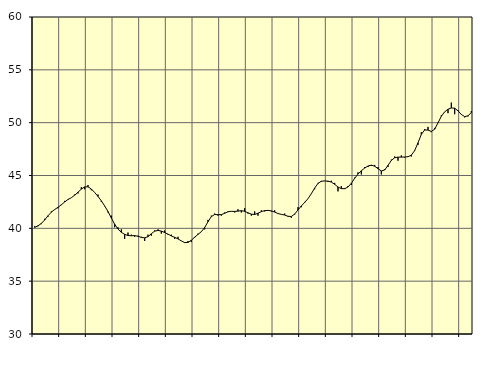
| Category | Piggar | Samtliga fast anställda (inkl. fast anställda utomlands) |
|---|---|---|
| nan | 40.2 | 40.09 |
| 87.0 | 40.2 | 40.24 |
| 87.0 | 40.4 | 40.46 |
| 87.0 | 40.9 | 40.79 |
| nan | 41.1 | 41.19 |
| 88.0 | 41.6 | 41.53 |
| 88.0 | 41.8 | 41.78 |
| 88.0 | 41.9 | 41.99 |
| nan | 42.2 | 42.23 |
| 89.0 | 42.6 | 42.49 |
| 89.0 | 42.7 | 42.73 |
| 89.0 | 42.9 | 42.9 |
| nan | 43.2 | 43.13 |
| 90.0 | 43.3 | 43.42 |
| 90.0 | 43.9 | 43.71 |
| 90.0 | 43.7 | 43.92 |
| nan | 44.1 | 43.93 |
| 91.0 | 43.6 | 43.72 |
| 91.0 | 43.4 | 43.39 |
| 91.0 | 43.2 | 43.02 |
| nan | 42.5 | 42.6 |
| 92.0 | 42.1 | 42.12 |
| 92.0 | 41.5 | 41.59 |
| 92.0 | 41.2 | 40.98 |
| nan | 40.1 | 40.39 |
| 93.0 | 40.1 | 39.93 |
| 93.0 | 39.9 | 39.62 |
| 93.0 | 39 | 39.43 |
| nan | 39.6 | 39.32 |
| 94.0 | 39.4 | 39.3 |
| 94.0 | 39.2 | 39.31 |
| 94.0 | 39.3 | 39.25 |
| nan | 39.2 | 39.14 |
| 95.0 | 38.8 | 39.1 |
| 95.0 | 39.4 | 39.21 |
| 95.0 | 39.3 | 39.49 |
| nan | 39.8 | 39.73 |
| 96.0 | 39.9 | 39.8 |
| 96.0 | 39.5 | 39.74 |
| 96.0 | 39.8 | 39.6 |
| nan | 39.4 | 39.45 |
| 97.0 | 39.4 | 39.28 |
| 97.0 | 39 | 39.15 |
| 97.0 | 39.2 | 39 |
| nan | 38.8 | 38.81 |
| 98.0 | 38.7 | 38.65 |
| 98.0 | 38.8 | 38.67 |
| 98.0 | 38.7 | 38.87 |
| nan | 39.1 | 39.16 |
| 99.0 | 39.5 | 39.43 |
| 99.0 | 39.7 | 39.68 |
| 99.0 | 39.9 | 40.08 |
| nan | 40.8 | 40.62 |
| 0.0 | 41.2 | 41.11 |
| 0.0 | 41.4 | 41.31 |
| 0.0 | 41.2 | 41.29 |
| nan | 41.2 | 41.3 |
| 1.0 | 41.5 | 41.42 |
| 1.0 | 41.6 | 41.57 |
| 1.0 | 41.6 | 41.61 |
| nan | 41.5 | 41.6 |
| 2.0 | 41.8 | 41.63 |
| 2.0 | 41.5 | 41.67 |
| 2.0 | 41.9 | 41.61 |
| nan | 41.4 | 41.47 |
| 3.0 | 41.2 | 41.34 |
| 3.0 | 41.6 | 41.31 |
| 3.0 | 41.2 | 41.43 |
| nan | 41.7 | 41.58 |
| 4.0 | 41.6 | 41.68 |
| 4.0 | 41.7 | 41.7 |
| 4.0 | 41.6 | 41.65 |
| nan | 41.7 | 41.54 |
| 5.0 | 41.4 | 41.4 |
| 5.0 | 41.3 | 41.32 |
| 5.0 | 41.4 | 41.26 |
| nan | 41.1 | 41.14 |
| 6.0 | 41 | 41.12 |
| 6.0 | 41.3 | 41.35 |
| 6.0 | 42 | 41.74 |
| nan | 42 | 42.12 |
| 7.0 | 42.5 | 42.45 |
| 7.0 | 42.8 | 42.81 |
| 7.0 | 43.3 | 43.28 |
| nan | 43.7 | 43.81 |
| 8.0 | 44.3 | 44.25 |
| 8.0 | 44.4 | 44.46 |
| 8.0 | 44.5 | 44.48 |
| nan | 44.4 | 44.47 |
| 9.0 | 44.5 | 44.38 |
| 9.0 | 44.3 | 44.17 |
| 9.0 | 43.5 | 43.91 |
| nan | 44 | 43.76 |
| 10.0 | 43.8 | 43.75 |
| 10.0 | 44 | 43.91 |
| 10.0 | 44.1 | 44.26 |
| nan | 44.8 | 44.73 |
| 11.0 | 45.3 | 45.13 |
| 11.0 | 45.1 | 45.45 |
| 11.0 | 45.8 | 45.7 |
| nan | 45.8 | 45.9 |
| 12.0 | 45.9 | 45.98 |
| 12.0 | 46 | 45.88 |
| 12.0 | 45.8 | 45.65 |
| nan | 45.1 | 45.43 |
| 13.0 | 45.6 | 45.52 |
| 13.0 | 45.8 | 45.96 |
| 13.0 | 46.5 | 46.43 |
| nan | 46.8 | 46.68 |
| 14.0 | 46.4 | 46.74 |
| 14.0 | 46.9 | 46.74 |
| 14.0 | 46.7 | 46.75 |
| nan | 46.8 | 46.78 |
| 15.0 | 46.8 | 46.92 |
| 15.0 | 47.4 | 47.36 |
| 15.0 | 47.9 | 48.09 |
| nan | 49.1 | 48.89 |
| 16.0 | 49.4 | 49.31 |
| 16.0 | 49.6 | 49.3 |
| 16.0 | 49.1 | 49.17 |
| nan | 49.5 | 49.38 |
| 17.0 | 50 | 49.98 |
| 17.0 | 50.7 | 50.61 |
| 17.0 | 51 | 51.02 |
| nan | 50.9 | 51.27 |
| 18.0 | 51.9 | 51.39 |
| 18.0 | 50.8 | 51.37 |
| 18.0 | 51.2 | 51.12 |
| nan | 50.8 | 50.78 |
| 19.0 | 50.5 | 50.57 |
| 19.0 | 50.6 | 50.65 |
| 19.0 | 51.1 | 50.96 |